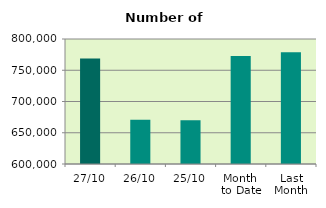
| Category | Series 0 |
|---|---|
| 27/10 | 768654 |
| 26/10 | 670978 |
| 25/10 | 670198 |
| Month 
to Date | 772969.895 |
| Last
Month | 778605.273 |